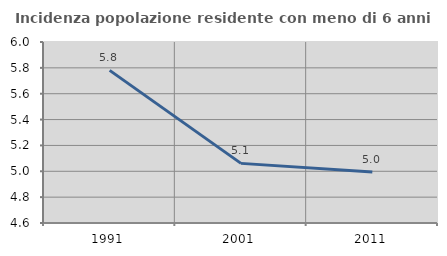
| Category | Incidenza popolazione residente con meno di 6 anni |
|---|---|
| 1991.0 | 5.781 |
| 2001.0 | 5.061 |
| 2011.0 | 4.995 |